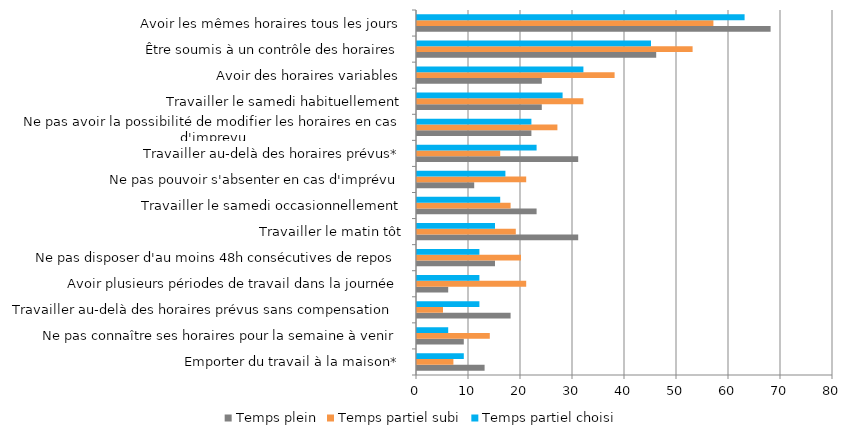
| Category | Temps plein | Temps partiel subi | Temps partiel choisi |
|---|---|---|---|
| Emporter du travail à la maison* | 13 | 7 | 9 |
| Ne pas connaître ses horaires pour la semaine à venir | 9 | 14 | 6 |
| Travailler au-delà des horaires prévus sans compensation  | 18 | 5 | 12 |
| Avoir plusieurs périodes de travail dans la journée | 6 | 21 | 12 |
| Ne pas disposer d'au moins 48h consécutives de repos | 15 | 20 | 12 |
| Travailler le matin tôt | 31 | 19 | 15 |
| Travailler le samedi occasionnellement | 23 | 18 | 16 |
| Ne pas pouvoir s'absenter en cas d'imprévu | 11 | 21 | 17 |
| Travailler au-delà des horaires prévus* | 31 | 16 | 23 |
| Ne pas avoir la possibilité de modifier les horaires en cas d'imprevu | 22 | 27 | 22 |
| Travailler le samedi habituellement | 24 | 32 | 28 |
| Avoir des horaires variables | 24 | 38 | 32 |
| Être soumis à un contrôle des horaires | 46 | 53 | 45 |
| Avoir les mêmes horaires tous les jours | 68 | 57 | 63 |